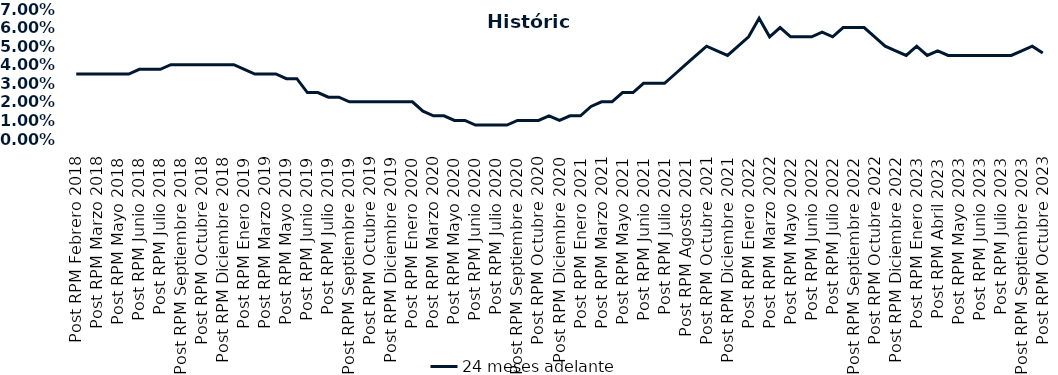
| Category | 24 meses adelante  |
|---|---|
| Post RPM Febrero 2018 | 0.035 |
| Pre RPM Marzo 2018 | 0.035 |
| Post RPM Marzo 2018 | 0.035 |
| Pre RPM Mayo 2018 | 0.035 |
| Post RPM Mayo 2018 | 0.035 |
| Pre RPM Junio 2018 | 0.035 |
| Post RPM Junio 2018 | 0.038 |
| Pre RPM Julio 2018 | 0.038 |
| Post RPM Julio 2018 | 0.038 |
| Pre RPM Septiembre 2018 | 0.04 |
| Post RPM Septiembre 2018 | 0.04 |
| Pre RPM Octubre 2018 | 0.04 |
| Post RPM Octubre 2018 | 0.04 |
| Pre RPM Diciembre 2018 | 0.04 |
| Post RPM Diciembre 2018 | 0.04 |
| Pre RPM Enero 2019 | 0.04 |
| Post RPM Enero 2019 | 0.038 |
| Pre RPM Marzo 2019 | 0.035 |
| Post RPM Marzo 2019 | 0.035 |
| Pre RPM Mayo 2019 | 0.035 |
| Post RPM Mayo 2019 | 0.032 |
| Pre RPM Junio 2019 | 0.032 |
| Post RPM Junio 2019 | 0.025 |
| Pre RPM Julio 2019 | 0.025 |
| Post RPM Julio 2019 | 0.022 |
| Pre RPM Septiembre 2019 | 0.022 |
| Post RPM Septiembre 2019 | 0.02 |
| Pre RPM Octubre 2019 | 0.02 |
| Post RPM Octubre 2019 | 0.02 |
| Pre RPM Diciembre 2019 | 0.02 |
| Post RPM Diciembre 2019 | 0.02 |
| Pre RPM Enero 2020 | 0.02 |
| Post RPM Enero 2020 | 0.02 |
| Pre RPM Marzo 2020 | 0.015 |
| Post RPM Marzo 2020 | 0.012 |
| Pre RPM Mayo 2020 | 0.012 |
| Post RPM Mayo 2020 | 0.01 |
| Pre RPM Junio 2020 | 0.01 |
| Post RPM Junio 2020 | 0.008 |
| Pre RPM Julio 2020 | 0.008 |
| Post RPM Julio 2020 | 0.008 |
| Pre RPM Septiembre 2020 | 0.008 |
| Post RPM Septiembre 2020 | 0.01 |
| Pre RPM Octubre 2020 | 0.01 |
| Post RPM Octubre 2020 | 0.01 |
| Pre RPM Diciembre 2020 | 0.012 |
| Post RPM Diciembre 2020 | 0.01 |
| Pre RPM Enero 2021 | 0.012 |
| Post RPM Enero 2021 | 0.012 |
| Pre RPM Marzo 2021 | 0.018 |
| Post RPM Marzo 2021 | 0.02 |
| Pre RPM Mayo 2021 | 0.02 |
| Post RPM Mayo 2021 | 0.025 |
| Pre RPM Junio 2021 | 0.025 |
| Post RPM Junio 2021 | 0.03 |
| Pre RPM Julio 2021 | 0.03 |
| Post RPM Julio 2021 | 0.03 |
| Pre RPM Agosto 2021 | 0.035 |
| Post RPM Agosto 2021 | 0.04 |
| Pre RPM Octubre 2021 | 0.045 |
| Post RPM Octubre 2021 | 0.05 |
| Pre RPM Diciembre 2021 | 0.048 |
| Post RPM Diciembre 2021 | 0.045 |
| Pre RPM Enero 2022 | 0.05 |
| Post RPM Enero 2022 | 0.055 |
| Pre RPM Marzo 2022 | 0.065 |
| Post RPM Marzo 2022 | 0.055 |
| Pre RPM Mayo 2022 | 0.06 |
| Post RPM Mayo 2022 | 0.055 |
| Pre RPM Junio 2022 | 0.055 |
| Post RPM Junio 2022 | 0.055 |
| Pre RPM Julio 2022 | 0.058 |
| Post RPM Julio 2022 | 0.055 |
| Pre RPM Septiembre 2022 | 0.06 |
| Post RPM Septiembre 2022 | 0.06 |
| Pre RPM Octubre 2022 | 0.06 |
| Post RPM Octubre 2022 | 0.055 |
| Pre RPM Diciembre 2022 | 0.05 |
| Post RPM Diciembre 2022 | 0.048 |
| Pre RPM Enero 2023 | 0.045 |
| Post RPM Enero 2023 | 0.05 |
| Pre RPM Abril 2023 | 0.045 |
| Post RPM Abril 2023 | 0.048 |
| Pre RPM Mayo 2023 | 0.045 |
| Post RPM Mayo 2023 | 0.045 |
| Pre RPM Junio 2023 | 0.045 |
| Post RPM Junio 2023 | 0.045 |
| Pre RPM Julio 2023 | 0.045 |
| Post RPM Julio 2023 | 0.045 |
| Pre RPM Septiembre 2023 | 0.045 |
| Post RPM Septiembre 2023 | 0.048 |
| Pre RPM Octubre 2023 | 0.05 |
| Post RPM Octubre 2023 | 0.046 |